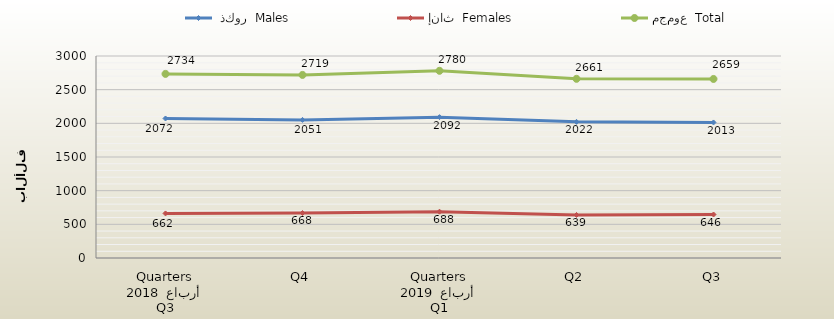
| Category |  ذكور  Males | إناث  Females | مجموع  Total |
|---|---|---|---|
| 0 | 2072 | 662 | 2734 |
| 1 | 2051 | 668 | 2719 |
| 2 | 2092 | 688 | 2780 |
| 3 | 2022 | 639 | 2661 |
| 4 | 2013 | 646 | 2659 |